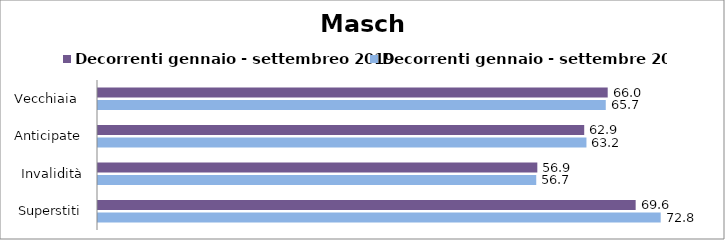
| Category | Decorrenti gennaio - settembreo 2019 | Decorrenti gennaio - settembre 2020 |
|---|---|---|
| Vecchiaia  | 65.98 | 65.73 |
|  Anticipate | 62.94 | 63.23 |
| Invalidità | 56.87 | 56.73 |
| Superstiti | 69.6 | 72.84 |